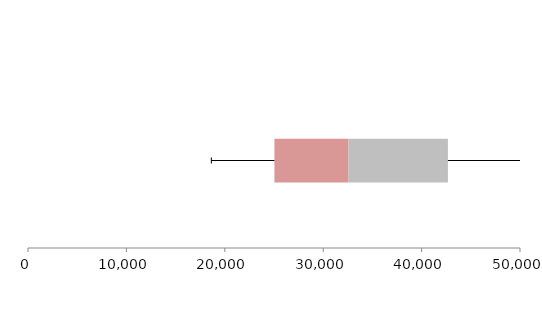
| Category | Series 1 | Series 2 | Series 3 |
|---|---|---|---|
| 0 | 25044.201 | 7500.459 | 10131.024 |